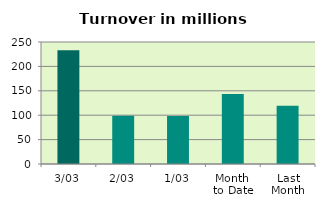
| Category | Series 0 |
|---|---|
| 3/03 | 233.323 |
| 2/03 | 99.003 |
| 1/03 | 98.425 |
| Month 
to Date | 143.583 |
| Last
Month | 119.242 |